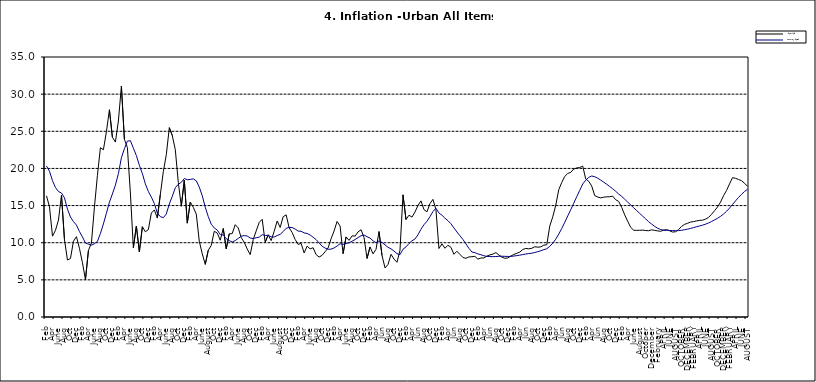
| Category | Year-on Rate | 12-Month Average |
|---|---|---|
| 09-Jan | 10.439 | 11.844 |
| Feb | 9.772 | 11.562 |
| Mar | 9.907 | 11.538 |
| Apr | 8.618 | 11.319 |
| May | 9.547 | 11.246 |
| June | 9.17 | 11.039 |
| July | 9.325 | 10.738 |
| Aug | 8.401 | 10.424 |
| Sept | 8.07 | 9.973 |
| Oct | 8.3 | 9.535 |
| Nov | 8.781 | 9.278 |
| Dec | 9.298 | 9.117 |
| 10-Jan | 10.534 | 9.136 |
| Feb | 11.584 | 9.297 |
| Mar | 12.864 | 9.555 |
| Apr | 12.24 | 9.859 |
| May | 8.524 | 9.769 |
| June | 10.781 | 9.904 |
| July | 10.313 | 9.987 |
| Aug | 10.924 | 10.197 |
| Sept | 10.891 | 10.43 |
| Oct | 11.457 | 10.689 |
| Nov | 11.748 | 10.932 |
| Dec | 10.699 | 11.042 |
| 11-Jan | 7.878 | 10.806 |
| Feb | 9.426 | 10.623 |
| Mar | 8.498 | 10.26 |
| Apr | 9.11 | 10.005 |
| May | 11.5 | 10.249 |
| Jun | 8.278 | 10.034 |
| Jul | 6.608 | 9.711 |
| Aug | 7.061 | 9.38 |
| Sep | 8.443 | 9.178 |
| Oct | 7.802 | 8.88 |
| Nov | 7.365 | 8.525 |
| Dec | 8.993 | 8.395 |
| 12-Jan | 16.445 | 9.119 |
| Feb | 13.123 | 9.443 |
| Mar | 13.701 | 9.889 |
| Apr | 13.447 | 10.259 |
| May | 14.127 | 10.496 |
| Jun | 15.012 | 11.062 |
| Jul | 15.63 | 11.81 |
| Aug | 14.456 | 12.422 |
| Sep | 14.162 | 12.893 |
| Oct | 15.26 | 13.506 |
| Nov | 15.836 | 14.199 |
| Dec | 14.459 | 14.637 |
| 13-Jan | 9.22 | 14.006 |
| Feb | 9.85 | 13.703 |
| Mar | 9.253 | 13.302 |
| Apr | 9.657 | 12.966 |
| May | 9.385 | 12.557 |
| Jun | 8.441 | 11.999 |
| Jul | 8.849 | 11.443 |
| Aug | 8.431 | 10.946 |
| Sep | 8.013 | 10.44 |
| Oct | 7.9 | 9.849 |
| Nov | 8.086 | 9.245 |
| Dec | 8.117 | 8.75 |
| 14-Jan | 8.164 | 8.662 |
| Feb | 7.791 | 8.493 |
| Mar | 7.937 | 8.384 |
| Apr | 7.947 | 8.246 |
| May | 8.195 | 8.151 |
| Jun | 8.358 | 8.146 |
| Jul | 8.464 | 8.118 |
| Aug | 8.673 | 8.141 |
| Sep | 8.357 | 8.17 |
| Oct | 8.064 | 8.182 |
| Nov | 7.902 | 8.165 |
| Dec | 7.948 | 8.151 |
| 15-Jan | 8.211 | 8.155 |
| Feb | 8.412 | 8.206 |
| Mar | 8.579 | 8.26 |
| Apr | 8.742 | 8.326 |
| May | 9.092 | 8.403 |
| Jun | 9.232 | 8.478 |
| Jul | 9.177 | 8.54 |
| Aug | 9.25 | 8.591 |
| Sep | 9.455 | 8.684 |
| Oct | 9.398 | 8.795 |
| Nov | 9.442 | 8.922 |
| Dec | 9.665 | 9.064 |
| 16-Jan | 9.728 | 9.19 |
| Feb | 12.254 | 9.516 |
| Mar | 13.485 | 9.935 |
| Apr | 15.052 | 10.474 |
| May | 17.148 | 11.165 |
| Jun | 18.111 | 11.925 |
| Jul | 18.927 | 12.754 |
| Aug | 19.325 | 13.605 |
| Sep | 19.476 | 14.444 |
| Oct | 19.914 | 15.318 |
| Nov | 20.067 | 16.193 |
| Dec | 20.118 | 17.05 |
| 17-Jan | 20.315 | 17.914 |
| Feb | 18.569 | 18.418 |
| Mar | 18.27 | 18.794 |
| Apr | 17.621 | 18.982 |
| May | 16.343 | 18.883 |
| Jun | 16.153 | 18.692 |
| Jul | 16.038 | 18.43 |
| Aug | 16.128 | 18.151 |
| Sep | 16.183 | 17.872 |
| Oct | 16.187 | 17.567 |
| Nov | 16.267 | 17.264 |
| Dec | 15.785 | 16.921 |
| 18-Jan | 15.559 | 16.55 |
| Feb | 14.763 | 16.241 |
| Mar | 13.748 | 15.866 |
| Apr | 12.893 | 15.468 |
| May | 12.077 | 15.096 |
| June | 11.683 | 14.706 |
| July | 11.661 | 14.329 |
| August | 11.673 | 13.951 |
| September | 11.697 | 13.578 |
| October | 11.64 | 13.206 |
| November | 11.615 | 12.831 |
| December | 11.731 | 12.509 |
| 19-Jan | 11.664 | 12.203 |
| February | 11.592 | 11.954 |
| MARCH | 11.535 | 11.78 |
| APRIL | 11.696 | 11.686 |
| MAY | 11.756 | 11.662 |
| JUNE | 11.605 | 11.655 |
| JULY | 11.432 | 11.635 |
| AUGUST | 11.479 | 11.618 |
| SEPTEMBER | 11.776 | 11.626 |
| OCTOBER | 12.202 | 11.676 |
| NOVEMBER | 12.469 | 11.75 |
| DECEMBER | 12.617 | 11.827 |
| JANUARY | 12.779 | 11.923 |
| FEBRUARY | 12.847 | 12.03 |
| MARCH | 12.932 | 12.147 |
| APRIL | 13.008 | 12.258 |
| MAY | 13.033 | 12.365 |
| JUNE | 13.178 | 12.496 |
| JULY | 13.403 | 12.659 |
| AUGUST | 13.827 | 12.855 |
| SEPTEMBER | 14.306 | 13.068 |
| OCTOBER | 14.811 | 13.289 |
| NOVEMBER | 15.466 | 13.546 |
| DECEMBER | 16.327 | 13.864 |
| JANUARY | 17.03 | 14.228 |
| FEBRUARY | 17.918 | 14.66 |
| MARCH | 18.756 | 15.154 |
| APRIL | 18.675 | 15.63 |
| MAY | 18.514 | 16.086 |
| JUNE | 18.348 | 16.512 |
| JULY | 18.007 | 16.886 |
| AUGUST | 17.59 | 17.187 |